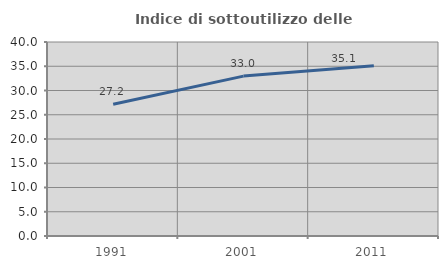
| Category | Indice di sottoutilizzo delle abitazioni  |
|---|---|
| 1991.0 | 27.162 |
| 2001.0 | 32.971 |
| 2011.0 | 35.09 |